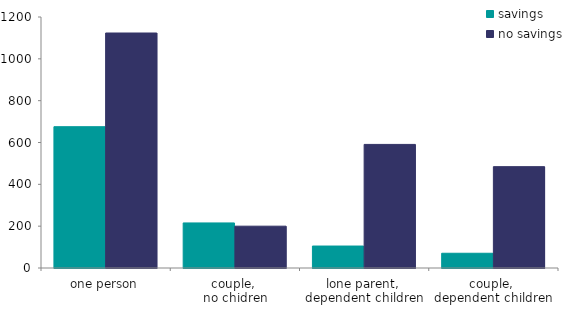
| Category | savings | no savings |
|---|---|---|
| one person | 675.535 | 1123.503 |
| couple, 
no chidren | 215.445 | 199.917 |
| lone parent, 
dependent children | 105.024 | 590.881 |
| couple, 
dependent children | 70.459 | 484.567 |